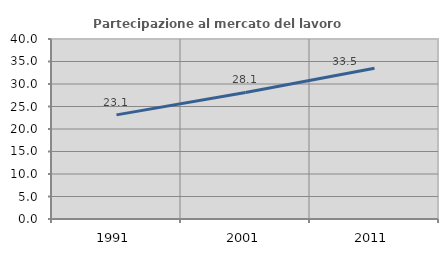
| Category | Partecipazione al mercato del lavoro  femminile |
|---|---|
| 1991.0 | 23.136 |
| 2001.0 | 28.125 |
| 2011.0 | 33.484 |